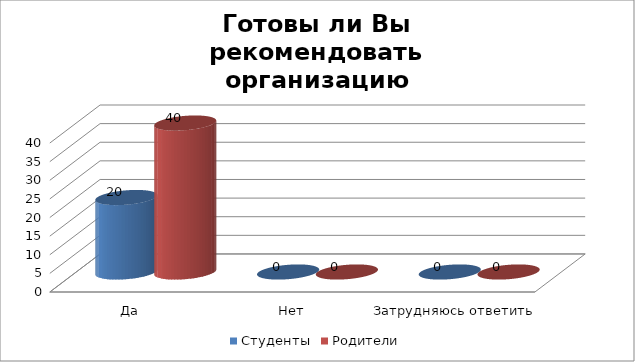
| Category | Студенты | Родители |
|---|---|---|
| Да | 20 | 40 |
| Нет | 0 | 0 |
| Затрудняюсь ответить | 0 | 0 |